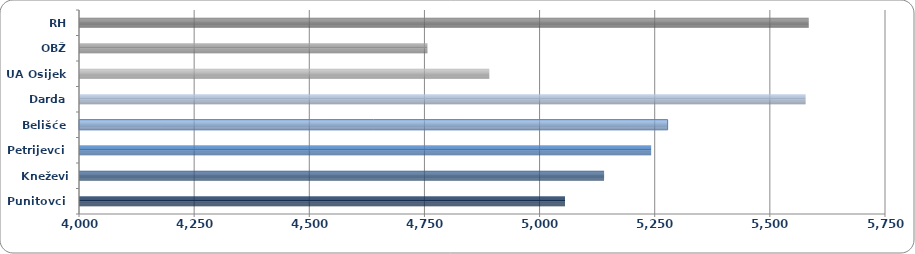
| Category | Prosječna mjesečna neto plaća |
|---|---|
| Punitovci | 5055.27 |
| Kneževi Vinogradi | 5140.128 |
| Petrijevci | 5242.222 |
| Belišće | 5278.045 |
| Darda | 5577.511 |
| UA Osijek | 4890.751 |
| OBŽ | 4756.436 |
| RH | 5584.326 |